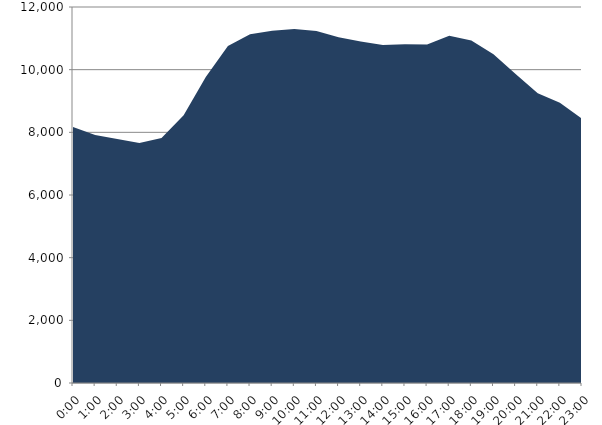
| Category | Series 0 | Series 1 |
|---|---|---|
| 2020-01-15 |  | 8170.294 |
| 2020-01-15 01:00:00 |  | 7912.567 |
| 2020-01-15 02:00:00 |  | 7790.482 |
| 2020-01-15 03:00:00 |  | 7660.873 |
| 2020-01-15 04:00:00 |  | 7822.925 |
| 2020-01-15 05:00:00 |  | 8548.503 |
| 2020-01-15 06:00:00 |  | 9763.116 |
| 2020-01-15 07:00:00 |  | 10753.799 |
| 2020-01-15 08:00:00 |  | 11133.473 |
| 2020-01-15 09:00:00 |  | 11239.266 |
| 2020-01-15 10:00:00 |  | 11294.849 |
| 2020-01-15 11:00:00 |  | 11233.193 |
| 2020-01-15 12:00:00 |  | 11033.308 |
| 2020-01-15 13:00:00 |  | 10902.548 |
| 2020-01-15 14:00:00 |  | 10789.678 |
| 2020-01-15 15:00:00 |  | 10808.055 |
| 2020-01-15 16:00:00 |  | 10806.452 |
| 2020-01-15 17:00:00 |  | 11083.946 |
| 2020-01-15 18:00:00 |  | 10927.314 |
| 2020-01-15 19:00:00 |  | 10492.443 |
| 2020-01-15 20:00:00 |  | 9861.348 |
| 2020-01-15 21:00:00 |  | 9247.111 |
| 2020-01-15 22:00:00 |  | 8944.959 |
| 2020-01-15 23:00:00 |  | 8435.212 |